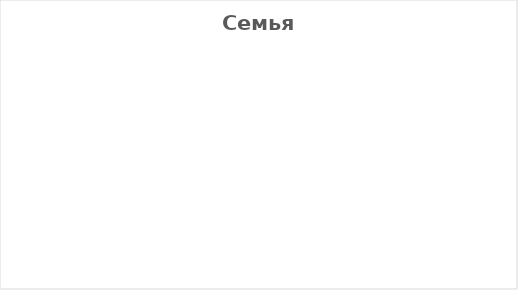
| Category | Series 0 |
|---|---|
| Тщеславие | 0 |
| Достоинство | 0 |
| Самоуничижение | 0 |